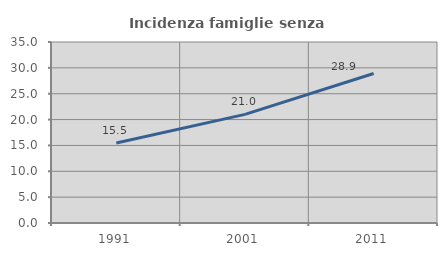
| Category | Incidenza famiglie senza nuclei |
|---|---|
| 1991.0 | 15.459 |
| 2001.0 | 21.003 |
| 2011.0 | 28.916 |